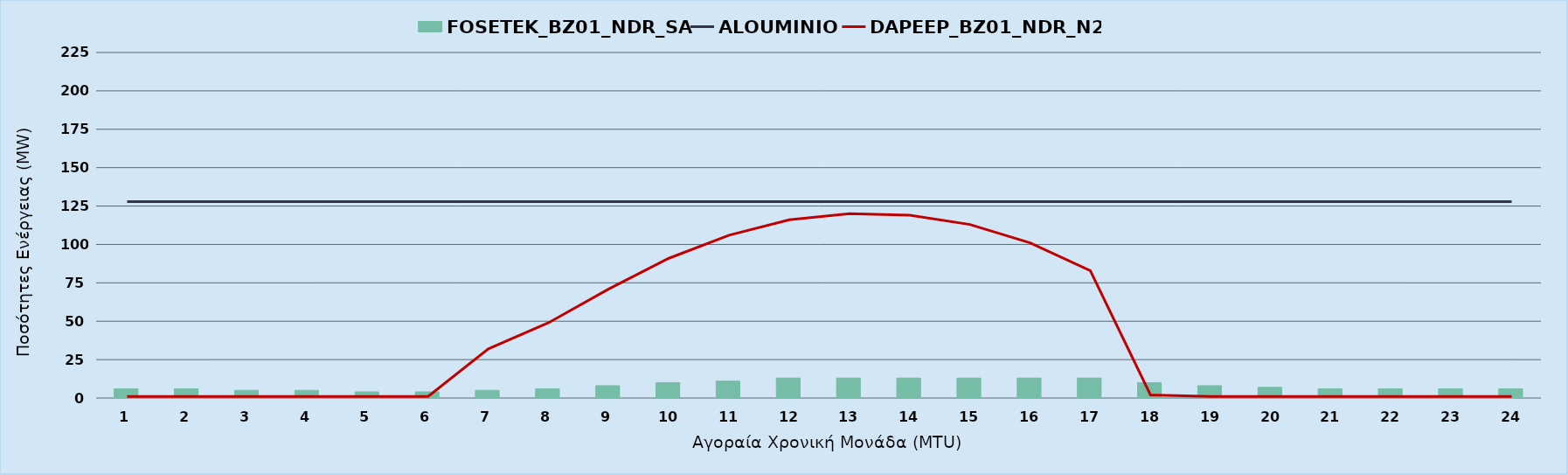
| Category | FOSETEK_BZ01_NDR_SA |
|---|---|
| 0 | 6 |
| 1 | 6 |
| 2 | 5 |
| 3 | 5 |
| 4 | 4 |
| 5 | 4 |
| 6 | 5 |
| 7 | 6 |
| 8 | 8 |
| 9 | 10 |
| 10 | 11 |
| 11 | 13 |
| 12 | 13 |
| 13 | 13 |
| 14 | 13 |
| 15 | 13 |
| 16 | 13 |
| 17 | 10 |
| 18 | 8 |
| 19 | 7 |
| 20 | 6 |
| 21 | 6 |
| 22 | 6 |
| 23 | 6 |